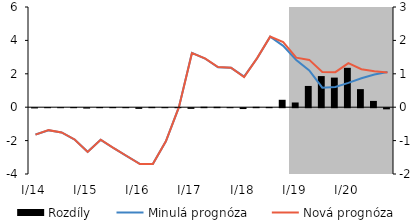
| Category | Rozdíly |
|---|---|
| I/14 | -0.007 |
| II | 0.002 |
| III | 0.001 |
| IV | 0.005 |
| I/15 | -0.011 |
| II | 0.006 |
| III | 0.005 |
| IV | 0.004 |
| I/16 | -0.02 |
| II | 0.009 |
| III | 0.004 |
| IV | 0.003 |
| I/17 | -0.02 |
| II | 0.014 |
| III | 0.012 |
| IV | 0.002 |
| I/18 | -0.025 |
| II | 0.012 |
| III | 0.008 |
| IV | 0.222 |
| I/19 | 0.141 |
| II | 0.636 |
| III | 0.932 |
| IV | 0.886 |
| I/20 | 1.179 |
| II | 0.541 |
| III | 0.188 |
| IV | -0.034 |